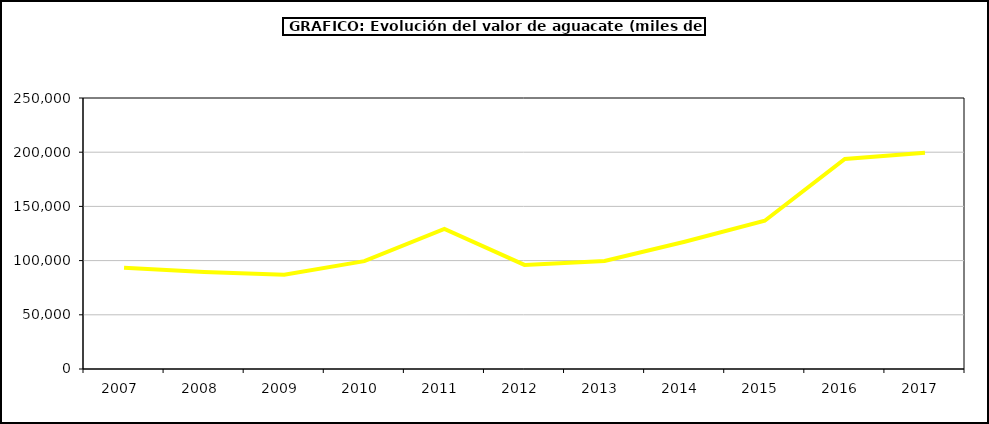
| Category | valor aguacate |
|---|---|
| 2007.0 | 93472.643 |
| 2008.0 | 89391.058 |
| 2009.0 | 86892.648 |
| 2010.0 | 99524.152 |
| 2011.0 | 129297.627 |
| 2012.0 | 96001.411 |
| 2013.0 | 99613.86 |
| 2014.0 | 117384.488 |
| 2015.0 | 136798 |
| 2016.0 | 193742 |
| 2017.0 | 199459.243 |